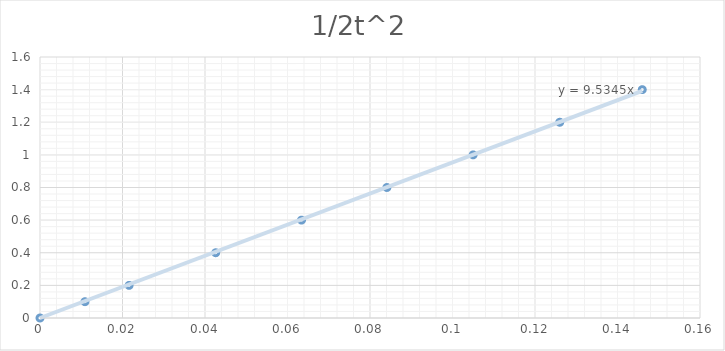
| Category | 1/2t^2 |
|---|---|
| 0.0 | 0 |
| 0.0109 | 0.1 |
| 0.0216 | 0.2 |
| 0.0426 | 0.4 |
| 0.0634 | 0.6 |
| 0.0841 | 0.8 |
| 0.105 | 1 |
| 0.126 | 1.2 |
| 0.146 | 1.4 |